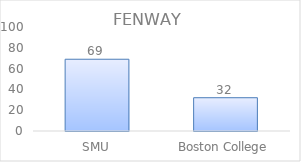
| Category | Series 0 |
|---|---|
| SMU | 69 |
| Boston College | 32 |